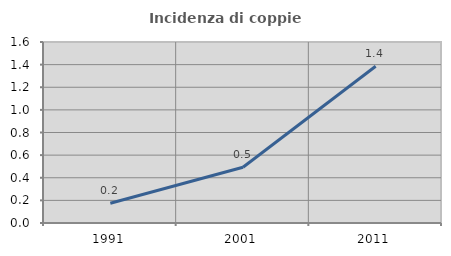
| Category | Incidenza di coppie miste |
|---|---|
| 1991.0 | 0.174 |
| 2001.0 | 0.493 |
| 2011.0 | 1.385 |